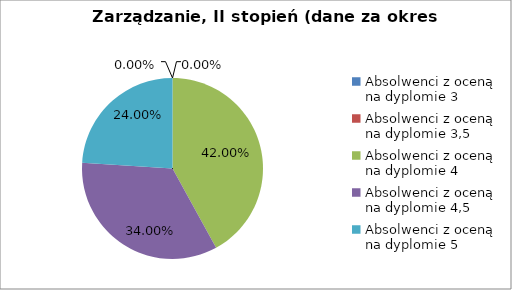
| Category | Series 0 |
|---|---|
| Absolwenci z oceną na dyplomie 3 | 0 |
| Absolwenci z oceną na dyplomie 3,5 | 0 |
| Absolwenci z oceną na dyplomie 4 | 42 |
| Absolwenci z oceną na dyplomie 4,5 | 34 |
| Absolwenci z oceną na dyplomie 5 | 24 |